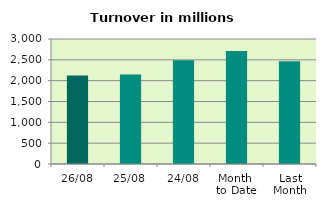
| Category | Series 0 |
|---|---|
| 26/08 | 2121.705 |
| 25/08 | 2148.564 |
| 24/08 | 2492.391 |
| Month 
to Date | 2712.498 |
| Last
Month | 2466.495 |